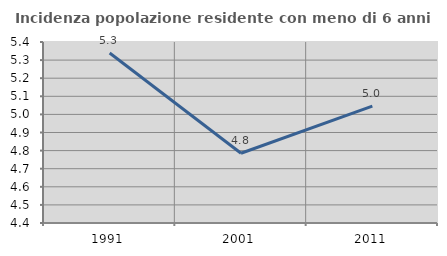
| Category | Incidenza popolazione residente con meno di 6 anni |
|---|---|
| 1991.0 | 5.339 |
| 2001.0 | 4.785 |
| 2011.0 | 5.046 |